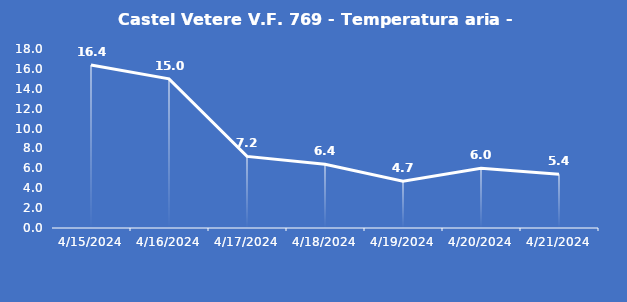
| Category | Castel Vetere V.F. 769 - Temperatura aria - Grezzo (°C) |
|---|---|
| 4/15/24 | 16.4 |
| 4/16/24 | 15 |
| 4/17/24 | 7.2 |
| 4/18/24 | 6.4 |
| 4/19/24 | 4.7 |
| 4/20/24 | 6 |
| 4/21/24 | 5.4 |